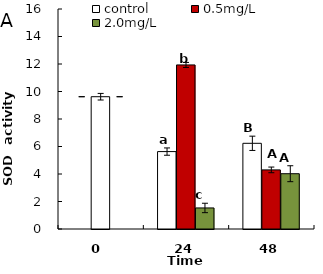
| Category | control | 0.5mg/L | 2.0mg/L |
|---|---|---|---|
| 0.0 | 9.621 | 9.621 | 9.621 |
| 24.0 | 5.63 | 11.932 | 1.531 |
| 48.0 | 6.233 | 4.299 | 4.021 |